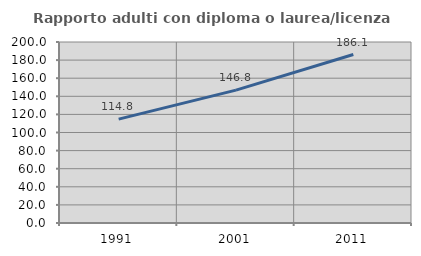
| Category | Rapporto adulti con diploma o laurea/licenza media  |
|---|---|
| 1991.0 | 114.799 |
| 2001.0 | 146.806 |
| 2011.0 | 186.137 |